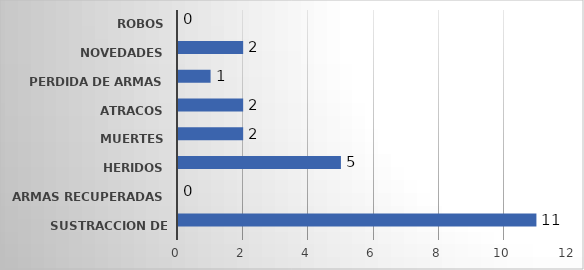
| Category | Series 1 | Series 0 |
|---|---|---|
| SUSTRACCION DE ARMAS |  | 11 |
| ARMAS RECUPERADAS |  | 0 |
| HERIDOS |  | 5 |
| MUERTES |  | 2 |
| ATRACOS |  | 2 |
| PERDIDA DE ARMAS |  | 1 |
| NOVEDADES |  | 2 |
| ROBOS |  | 0 |